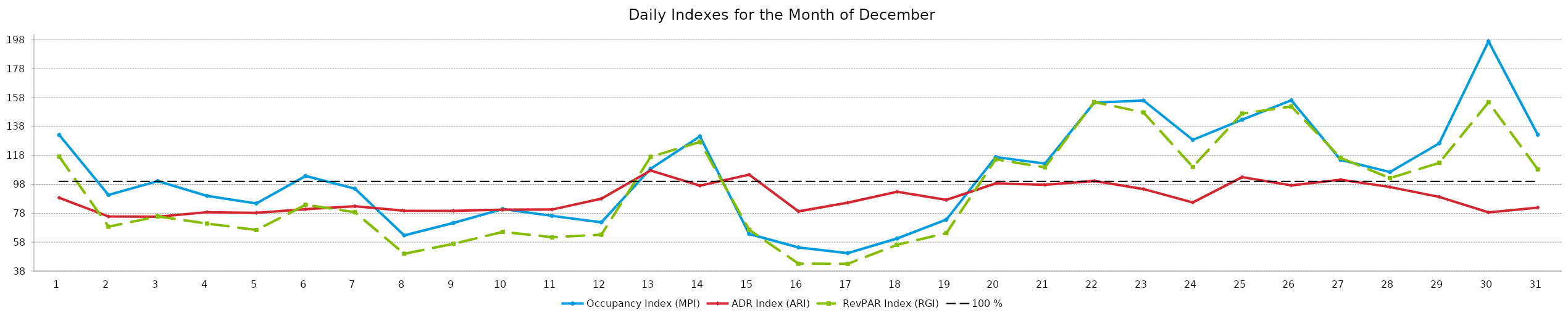
| Category | Occupancy Index (MPI) | ADR Index (ARI) | RevPAR Index (RGI) | 100 % |
|---|---|---|---|---|
| 1.0 | 132.142 | 88.683 | 117.188 | 100 |
| 2.0 | 90.66 | 75.778 | 68.7 | 100 |
| 3.0 | 100.222 | 75.601 | 75.769 | 100 |
| 4.0 | 90.03 | 78.73 | 70.881 | 100 |
| 5.0 | 84.79 | 78.29 | 66.382 | 100 |
| 6.0 | 103.786 | 80.792 | 83.851 | 100 |
| 7.0 | 94.983 | 82.855 | 78.698 | 100 |
| 8.0 | 62.699 | 79.72 | 49.984 | 100 |
| 9.0 | 71.308 | 79.681 | 56.819 | 100 |
| 10.0 | 80.925 | 80.491 | 65.137 | 100 |
| 11.0 | 76.176 | 80.555 | 61.363 | 100 |
| 12.0 | 71.72 | 88.053 | 63.151 | 100 |
| 13.0 | 108.793 | 107.562 | 117.02 | 100 |
| 14.0 | 131.17 | 97.05 | 127.301 | 100 |
| 15.0 | 63.603 | 104.673 | 66.575 | 100 |
| 16.0 | 54.354 | 79.287 | 43.095 | 100 |
| 17.0 | 50.415 | 85.323 | 43.016 | 100 |
| 18.0 | 60.534 | 92.844 | 56.202 | 100 |
| 19.0 | 73.593 | 87.24 | 64.202 | 100 |
| 20.0 | 116.863 | 98.61 | 115.239 | 100 |
| 21.0 | 112.32 | 97.729 | 109.769 | 100 |
| 22.0 | 154.479 | 100.296 | 154.936 | 100 |
| 23.0 | 155.962 | 94.724 | 147.734 | 100 |
| 24.0 | 128.745 | 85.483 | 110.055 | 100 |
| 25.0 | 142.688 | 102.98 | 146.94 | 100 |
| 26.0 | 156.116 | 97.257 | 151.834 | 100 |
| 27.0 | 114.908 | 101.174 | 116.257 | 100 |
| 28.0 | 106.448 | 96.129 | 102.327 | 100 |
| 29.0 | 126.337 | 89.317 | 112.84 | 100 |
| 30.0 | 196.883 | 78.584 | 154.72 | 100 |
| 31.0 | 132.289 | 81.923 | 108.375 | 100 |